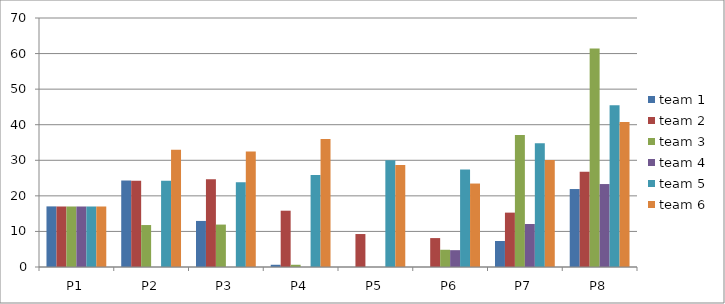
| Category | team 1 | team 2 | team 3 | team 4 | team 5 | team 6 |
|---|---|---|---|---|---|---|
| P1 | 17.039 | 17.01 | 17.01 | 17.01 | 17.01 | 17.01 |
| P2 | 24.292 | 24.257 | 11.796 | 0 | 24.212 | 32.965 |
| P3 | 12.95 | 24.692 | 11.926 | 0 | 23.826 | 32.492 |
| P4 | 0.628 | 15.827 | 0.628 | 0 | 25.835 | 35.959 |
| P5 | 0 | 9.269 | 0 | 0 | 30.024 | 28.687 |
| P6 | 0 | 8.129 | 4.844 | 4.734 | 27.442 | 23.464 |
| P7 | 7.31 | 15.286 | 37.094 | 12.084 | 34.761 | 30.077 |
| P8 | 21.918 | 26.772 | 61.432 | 23.321 | 45.494 | 40.772 |